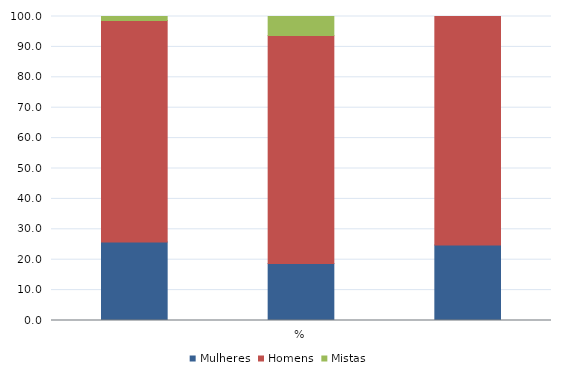
| Category | Mulheres | Homens | Mistas |
|---|---|---|---|
| 0 | 25.862 | 72.797 | 1.341 |
| 1 | 18.75 | 75 | 6.25 |
| 2 | 24.855 | 75.145 | 0 |